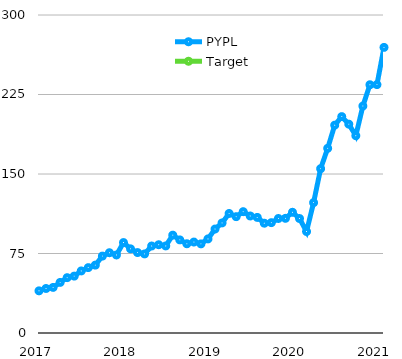
| Category | PYPL | Target |
|---|---|---|
| 2017 | 39.78 |  |
|  | 42 |  |
|  | 43.02 |  |
|  | 47.72 |  |
|  | 52.21 |  |
|  | 53.67 |  |
|  | 58.55 |  |
|  | 61.68 |  |
|  | 64.03 |  |
|  | 72.56 |  |
|  | 75.73 |  |
|  | 73.62 |  |
| 2018 | 85.32 |  |
|  | 79.41 |  |
|  | 75.87 |  |
|  | 74.61 |  |
|  | 82.07 |  |
|  | 83.27 |  |
|  | 82.14 |  |
|  | 92.33 |  |
|  | 87.84 |  |
|  | 84.19 |  |
|  | 85.81 |  |
|  | 84.09 |  |
| 2019 | 88.76 |  |
|  | 98.07 |  |
|  | 103.84 |  |
|  | 112.77 |  |
|  | 109.75 |  |
|  | 114.46 |  |
|  | 110.4 |  |
|  | 109.05 |  |
|  | 103.59 |  |
|  | 104.1 |  |
|  | 108.01 |  |
|  | 108.17 |  |
| 2020 | 113.89 |  |
|  | 107.99 |  |
|  | 95.74 |  |
|  | 123 |  |
|  | 155.01 |  |
|  | 174.23 |  |
|  | 196.07 |  |
|  | 204.14 |  |
|  | 197.03 |  |
|  | 186.13 |  |
|  | 214.12 |  |
|  | 234.2 |  |
| 2021 | 234.31 |  |
|  | 269.44 |  |